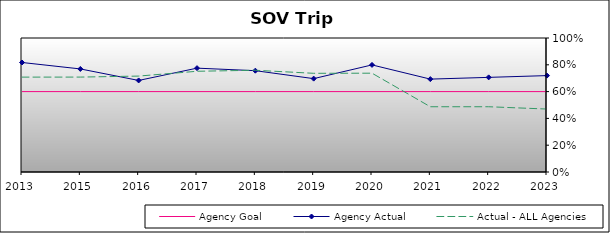
| Category | Agency Goal | Agency Actual | Actual - ALL Agencies |
|---|---|---|---|
| 2013.0 | 0.6 | 0.817 | 0.708 |
| 2015.0 | 0.6 | 0.769 | 0.708 |
| 2016.0 | 0.6 | 0.683 | 0.716 |
| 2017.0 | 0.6 | 0.775 | 0.752 |
| 2018.0 | 0.6 | 0.756 | 0.759 |
| 2019.0 | 0.6 | 0.697 | 0.736 |
| 2020.0 | 0.6 | 0.799 | 0.737 |
| 2021.0 | 0.6 | 0.693 | 0.487 |
| 2022.0 | 0.6 | 0.706 | 0.487 |
| 2023.0 | 0.6 | 0.719 | 0.47 |